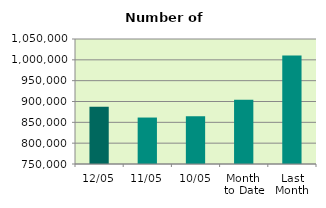
| Category | Series 0 |
|---|---|
| 12/05 | 887560 |
| 11/05 | 861506 |
| 10/05 | 864808 |
| Month 
to Date | 904190.667 |
| Last
Month | 1010681.333 |